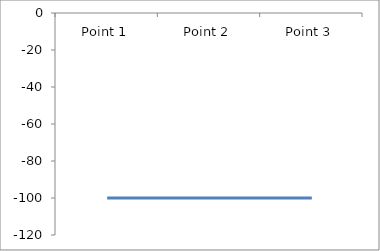
| Category | Series 7 |
|---|---|
| Point 1 | -100 |
| Point 2 | -100 |
| Point 3 | -100 |